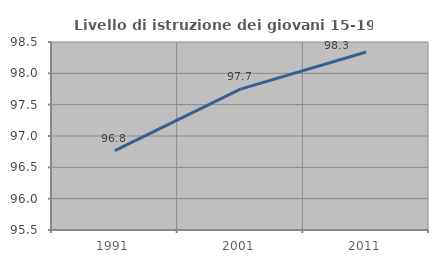
| Category | Livello di istruzione dei giovani 15-19 anni |
|---|---|
| 1991.0 | 96.766 |
| 2001.0 | 97.748 |
| 2011.0 | 98.34 |